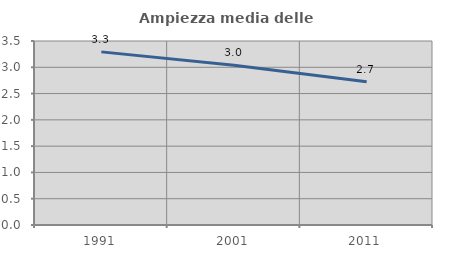
| Category | Ampiezza media delle famiglie |
|---|---|
| 1991.0 | 3.293 |
| 2001.0 | 3.037 |
| 2011.0 | 2.726 |